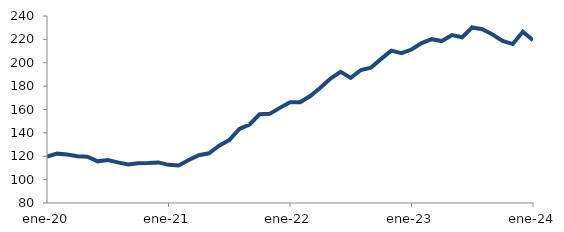
| Category | Series 0 |
|---|---|
| 2020-01-01 | 119.642 |
| 2020-02-01 | 122.238 |
| 2020-03-01 | 121.406 |
| 2020-04-01 | 120.076 |
| 2020-05-01 | 119.592 |
| 2020-06-01 | 115.658 |
| 2020-07-01 | 116.729 |
| 2020-08-01 | 114.728 |
| 2020-09-01 | 113.012 |
| 2020-10-01 | 114.05 |
| 2020-11-01 | 114.24 |
| 2020-12-01 | 114.741 |
| 2021-01-01 | 112.625 |
| 2021-02-01 | 112.14 |
| 2021-03-01 | 116.74 |
| 2021-04-01 | 120.911 |
| 2021-05-01 | 122.536 |
| 2021-06-01 | 128.968 |
| 2021-07-01 | 133.864 |
| 2021-08-01 | 143.384 |
| 2021-09-01 | 147.196 |
| 2021-10-01 | 155.883 |
| 2021-11-01 | 156.426 |
| 2021-12-01 | 161.4 |
| 2022-01-01 | 166.276 |
| 2022-02-01 | 166.219 |
| 2022-03-01 | 171.531 |
| 2022-04-01 | 178.644 |
| 2022-05-01 | 186.465 |
| 2022-06-01 | 192.187 |
| 2022-07-01 | 187.044 |
| 2022-08-01 | 193.806 |
| 2022-09-01 | 195.846 |
| 2022-10-01 | 203.287 |
| 2022-11-01 | 210.344 |
| 2022-12-01 | 208.16 |
| 2023-01-01 | 211.29 |
| 2023-02-01 | 216.772 |
| 2023-03-01 | 220.156 |
| 2023-04-01 | 218.537 |
| 2023-05-01 | 223.702 |
| 2023-06-01 | 221.798 |
| 2023-07-01 | 230.236 |
| 2023-08-01 | 228.637 |
| 2023-09-01 | 224.175 |
| 2023-10-01 | 218.647 |
| 2023-11-01 | 215.985 |
| 2023-12-01 | 226.505 |
| 2024-01-01 | 219.392 |